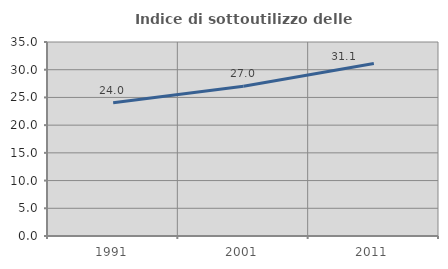
| Category | Indice di sottoutilizzo delle abitazioni  |
|---|---|
| 1991.0 | 24.025 |
| 2001.0 | 27 |
| 2011.0 | 31.119 |